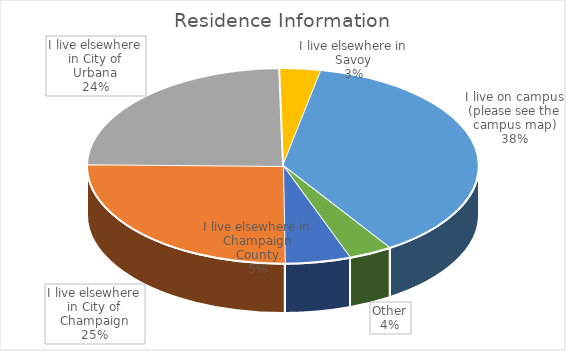
| Category | Series 0 | Series 1 |
|---|---|---|
| I live elsewhere in Champaign County | 33 | 0.054 |
| I live elsewhere in City of Champaign | 155 | 0.254 |
| I live elsewhere in City of Urbana | 149 | 0.244 |
| I live elsewhere in Savoy | 21 | 0.034 |
| I live on campus (please see the campus map) | 230 | 0.377 |
| Other | 22 | 0.036 |